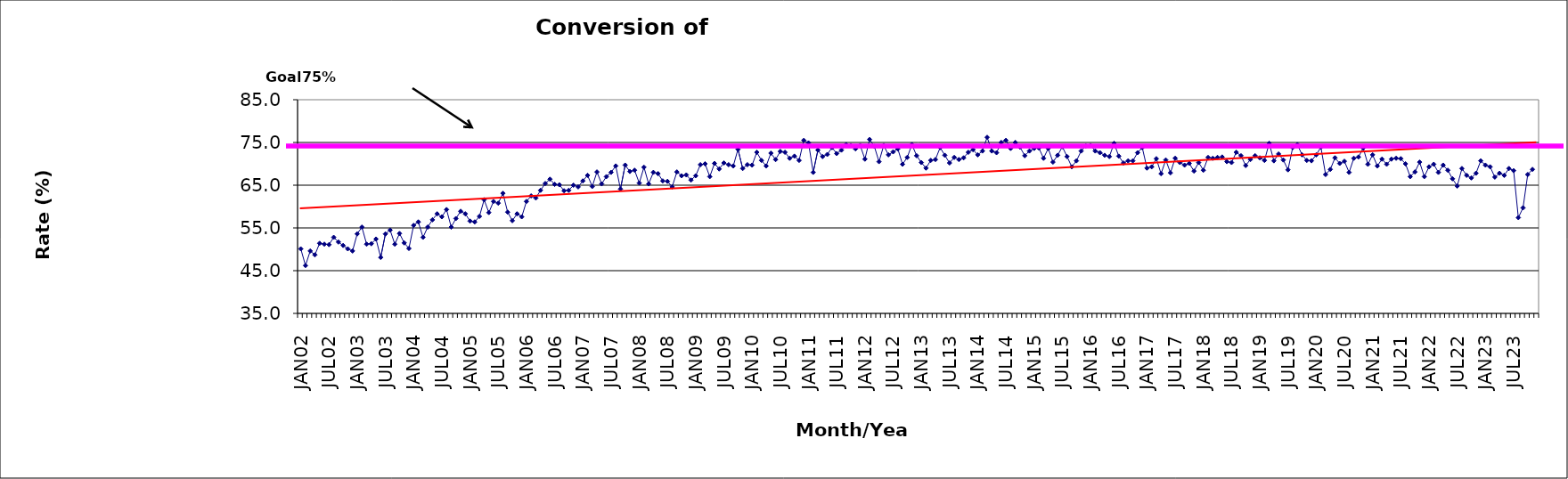
| Category | Series 0 |
|---|---|
| JAN02 | 50.1 |
| FEB02 | 46.2 |
| MAR02 | 49.6 |
| APR02 | 48.7 |
| MAY02 | 51.4 |
| JUN02 | 51.2 |
| JUL02 | 51.1 |
| AUG02 | 52.8 |
| SEP02 | 51.7 |
| OCT02 | 50.9 |
| NOV02 | 50.1 |
| DEC02 | 49.6 |
| JAN03 | 53.6 |
| FEB03 | 55.2 |
| MAR03 | 51.2 |
| APR03 | 51.3 |
| MAY03 | 52.4 |
| JUN03 | 48.1 |
| JUL03 | 53.6 |
| AUG03 | 54.5 |
| SEP03 | 51.2 |
| OCT03 | 53.7 |
| NOV03 | 51.5 |
| DEC03 | 50.2 |
| JAN04 | 55.6 |
| FEB04 | 56.4 |
| MAR04 | 52.8 |
| APR04 | 55.2 |
| MAY04 | 56.9 |
| JUN04 | 58.3 |
| JUL04 | 57.6 |
| AUG04 | 59.3 |
| SEP04 | 55.2 |
| OCT04 | 57.2 |
| NOV04 | 58.9 |
| DEC04 | 58.3 |
| JAN05 | 56.6 |
| FEB05 | 56.4 |
| MAR05 | 57.7 |
| APR05 | 61.6 |
| MAY05 | 58.6 |
| JUN05 | 61.2 |
| JUL05 | 60.8 |
| AUG05 | 63.1 |
| SEP05 | 58.7 |
| OCT05 | 56.7 |
| NOV05 | 58.3 |
| DEC05 | 57.6 |
| JAN06 | 61.2 |
| FEB06 | 62.5 |
| MAR06 | 62 |
| APR06 | 63.8 |
| MAY06 | 65.4 |
| JUN06 | 66.4 |
| JUL06 | 65.2 |
| AUG06 | 65.1 |
| SEP06 | 63.7 |
| OCT06 | 63.8 |
| NOV06 | 65 |
| DEC06 | 64.6 |
| JAN07 | 66 |
| FEB07 | 67.3 |
| MAR07 | 64.7 |
| APR07 | 68.1 |
| MAY07 | 65.3 |
| JUN07 | 67 |
| JUL07 | 68 |
| AUG07 | 69.5 |
| SEP07 | 64.1 |
| OCT07 | 69.7 |
| NOV07 | 68.2 |
| DEC07 | 68.5 |
| JAN08 | 65.5 |
| FEB08 | 69.2 |
| MAR08 | 65.3 |
| APR08 | 68 |
| MAY08 | 67.7 |
| JUN08 | 66 |
| JUL08 | 65.9 |
| AUG08 | 64.6 |
| SEP08 | 68.1 |
| OCT08 | 67.2 |
| NOV08 | 67.4 |
| DEC08 | 66.2 |
| JAN09 | 67.2 |
| FEB09 | 69.8 |
| MAR09 | 70 |
| APR09 | 67 |
| MAY09 | 70.1 |
| JUN09 | 68.8 |
| JUL09 | 70.2 |
| AUG09 | 69.8 |
| SEP09 | 69.5 |
| OCT09 | 73.4 |
| NOV09 | 68.9 |
| DEC09 | 69.8 |
| JAN10 | 69.7 |
| FEB10 | 72.7 |
| MAR10 | 70.8 |
| APR10 | 69.5 |
| MAY10 | 72.5 |
| JUN10 | 71 |
| JUL10 | 72.9 |
| AUG10 | 72.7 |
| SEP10 | 71.3 |
| OCT10 | 71.8 |
| NOV10 | 70.8 |
| DEC10 | 75.5 |
| JAN11 | 74.9 |
| FEB11 | 68 |
| MAR11 | 73.2 |
| APR11 | 71.7 |
| MAY11 | 72.2 |
| JUN11 | 73.8 |
| JUL11 | 72.4 |
| AUG11 | 73.2 |
| SEP11 | 74.5 |
| OCT11 | 74.3 |
| NOV11 | 73.5 |
| DEC11 | 74.3 |
| JAN12 | 71.1 |
| FEB12 | 75.7 |
| MAR12 | 74.1 |
| APR12 | 70.5 |
| MAY12 | 74.3 |
| JUN12 | 72.1 |
| JUL12 | 72.8 |
| AUG12 | 73.5 |
| SEP12 | 69.9 |
| OCT12 | 71.5 |
| NOV12 | 74.5 |
| DEC12 | 71.9 |
| JAN13 | 70.3 |
| FEB13 | 69 |
| MAR13 | 70.8 |
| APR13 | 71 |
| MAY13 | 73.8 |
| JUN13 | 72 |
| JUL13 | 70.2 |
| AUG13 | 71.5 |
| SEP13 | 71 |
| OCT13 | 71.4 |
| NOV13 | 72.7 |
| DEC13 | 73.3 |
| JAN14 | 72.1 |
| FEB14 | 73 |
| MAR14 | 76.2 |
| APR14 | 73 |
| MAY14 | 72.6 |
| JUN14 | 75 |
| JUL14 | 75.5 |
| AUG14 | 73.6 |
| SEP14 | 75 |
| OCT14 | 73.9 |
| NOV14 | 71.9 |
| DEC14 | 73 |
| JAN15 | 73.6 |
| FEB15 | 73.7 |
| MAR15 | 71.3 |
| APR15 | 73.6 |
| MAY15 | 70.4 |
| JUN15 | 72 |
| JUL15 | 74 |
| AUG15 | 71.7 |
| SEP15 | 69.3 |
| OCT15 | 70.7 |
| NOV15 | 73 |
| DEC15 | 74.2 |
| JAN16 | 74.3 |
| FEB16 | 73 |
| MAR16 | 72.6 |
| APR16 | 72 |
| MAY16 | 71.7 |
| JUN16 | 74.8 |
| JUL16 | 71.8 |
| AUG16 | 70.2 |
| SEP16 | 70.7 |
| OCT16 | 70.7 |
| NOV16 | 72.6 |
| DEC16 | 73.8 |
| JAN17 | 69 |
| FEB17 | 69.3 |
| MAR17 | 71.2 |
| APR17 | 67.7 |
| MAY17 | 70.9 |
| JUN17 | 67.9 |
| JUL17 | 71.3 |
| AUG17 | 70.3 |
| SEP17 | 69.7 |
| OCT17 | 70.1 |
| NOV17 | 68.3 |
| DEC17 | 70.3 |
| JAN18 | 68.5 |
| FEB18 | 71.5 |
| MAR18 | 71.3 |
| APR18 | 71.5 |
| MAY18 | 71.6 |
| JUN18 | 70.5 |
| JUL18 | 70.3 |
| AUG18 | 72.7 |
| SEP18 | 71.9 |
| OCT18 | 69.6 |
| NOV18 | 71 |
| DEC18 | 71.9 |
| JAN19 | 71.4 |
| FEB19 | 70.8 |
| MAR19 | 74.8 |
| APR19 | 70.7 |
| MAY19 | 72.3 |
| JUN19 | 70.9 |
| JUL19 | 68.6 |
| AUG19 | 73.8 |
| SEP19 | 74.5 |
| OCT19 | 72.1 |
| NOV19 | 70.8 |
| DEC19 | 70.7 |
| JAN20 | 72.1 |
| FEB20 | 73.9 |
| MAR20 | 67.5 |
| APR20 | 68.7 |
| MAY20 | 71.4 |
| JUN20 | 70.1 |
| JUL20 | 70.6 |
| AUG20 | 68 |
| SEP20 | 71.3 |
| OCT20 | 71.6 |
| NOV20 | 73.7 |
| DEC20 | 69.9 |
| JAN21 | 72.1 |
| FEB21 | 69.5 |
| MAR21 | 71.1 |
| APR21 | 69.9 |
| MAY21 | 71.1 |
| JUN21 | 71.3 |
| JUL21 | 71.2 |
| AUG21 | 70 |
| SEP21 | 67 |
| OCT21 | 68.1 |
| NOV21 | 70.4 |
| DEC21 | 67 |
| JAN22 | 69.3 |
| FEB22 | 69.9 |
| MAR22 | 68 |
| APR22 | 69.7 |
| MAY22 | 68.5 |
| JUN22 | 66.5 |
| JUL22 | 64.8 |
| AUG22 | 68.9 |
| SEP22 | 67.3 |
| OCT22 | 66.7 |
| NOV22 | 67.8 |
| DEC22 | 70.7 |
| JAN23 | 69.7 |
| FEB23 | 69.3 |
| MAR23 | 66.9 |
| APR23 | 67.8 |
| MAY23 | 67.3 |
| JUN23 | 68.9 |
| JUL23 | 68.4 |
| AUG23 | 57.4 |
| SEP23 | 59.7 |
| OCT23 | 67.5 |
| NOV23 | 68.7 |